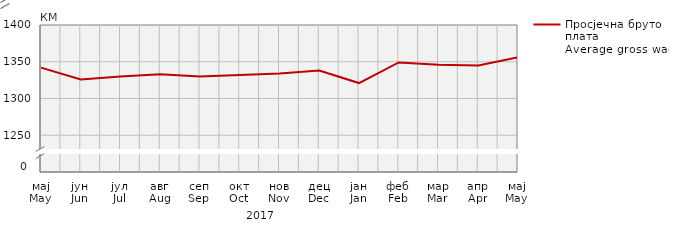
| Category | Просјечна бруто плата
Average gross wage |
|---|---|
| мај
May | 1342 |
| јун
Jun | 1326 |
| јул
Jul | 1330 |
| авг
Aug | 1333 |
| сеп
Sep | 1330 |
| окт
Oct | 1332 |
| нов
Nov | 1334 |
| дец
Dec | 1338 |
| јан
Jan | 1321 |
| феб
Feb | 1349 |
| мар
Mar | 1346 |
| апр
Apr | 1345 |
| мај
May | 1356 |